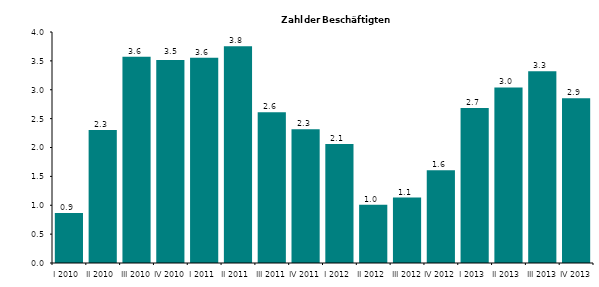
| Category | Series 0 |
|---|---|
| I 2010 | 0.867 |
| II 2010 | 2.304 |
| III 2010 | 3.573 |
| IV 2010 | 3.516 |
| I 2011 | 3.556 |
| II 2011 | 3.754 |
| III 2011 | 2.61 |
| IV 2011 | 2.316 |
| I 2012 | 2.063 |
| II 2012 | 1.009 |
| III 2012 | 1.132 |
| IV 2012 | 1.607 |
| I 2013 | 2.682 |
| II 2013 | 3.039 |
| III 2013 | 3.322 |
| IV 2013 | 2.855 |